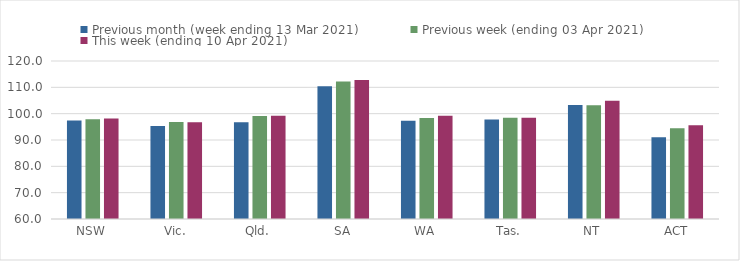
| Category | Previous month (week ending 13 Mar 2021) | Previous week (ending 03 Apr 2021) | This week (ending 10 Apr 2021) |
|---|---|---|---|
| NSW | 97.36 | 97.85 | 98.17 |
| Vic. | 95.34 | 96.8 | 96.77 |
| Qld. | 96.73 | 99.15 | 99.21 |
| SA | 110.45 | 112.17 | 112.82 |
| WA | 97.34 | 98.37 | 99.25 |
| Tas. | 97.76 | 98.46 | 98.46 |
| NT | 103.25 | 103.15 | 104.91 |
| ACT | 91.07 | 94.45 | 95.56 |